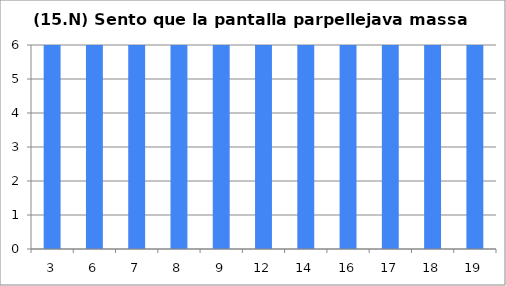
| Category | 15 |
|---|---|
| 3.0 | 6 |
| 6.0 | 6 |
| 7.0 | 6 |
| 8.0 | 6 |
| 9.0 | 6 |
| 12.0 | 6 |
| 14.0 | 6 |
| 16.0 | 6 |
| 17.0 | 6 |
| 18.0 | 6 |
| 19.0 | 6 |